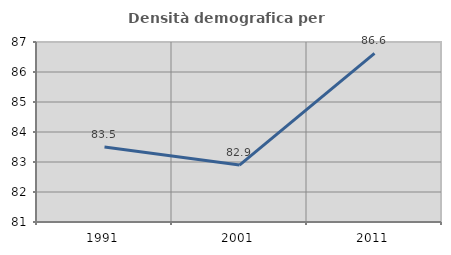
| Category | Densità demografica |
|---|---|
| 1991.0 | 83.5 |
| 2001.0 | 82.899 |
| 2011.0 | 86.623 |